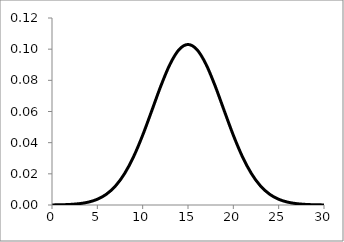
| Category | Series 0 |
|---|---|
| 0.0 | 0 |
| 1.0 | 0 |
| 2.0 | 0 |
| 3.0 | 0.001 |
| 4.0 | 0.002 |
| 5.0 | 0.004 |
| 6.0 | 0.007 |
| 7.0 | 0.012 |
| 8.0 | 0.02 |
| 9.0 | 0.031 |
| 10.0 | 0.045 |
| 11.0 | 0.06 |
| 12.0 | 0.076 |
| 13.0 | 0.09 |
| 14.0 | 0.1 |
| 15.0 | 0.103 |
| 16.0 | 0.1 |
| 17.0 | 0.09 |
| 18.0 | 0.076 |
| 19.0 | 0.06 |
| 20.0 | 0.045 |
| 21.0 | 0.031 |
| 22.0 | 0.02 |
| 23.0 | 0.012 |
| 24.0 | 0.007 |
| 25.0 | 0.004 |
| 26.0 | 0.002 |
| 27.0 | 0.001 |
| 28.0 | 0 |
| 29.0 | 0 |
| 30.0 | 0 |